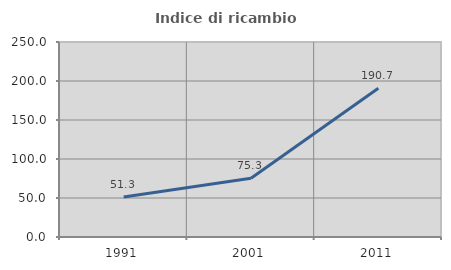
| Category | Indice di ricambio occupazionale  |
|---|---|
| 1991.0 | 51.267 |
| 2001.0 | 75.253 |
| 2011.0 | 190.747 |